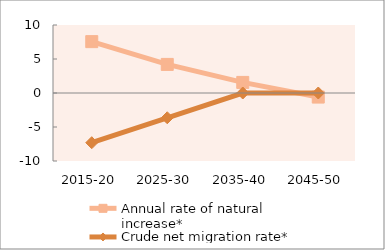
| Category | Annual rate of natural increase* | Crude net migration rate* |
|---|---|---|
| 2015-20 | 7.555 | -7.31 |
| 2025-30 | 4.204 | -3.641 |
| 2035-40 | 1.557 | 0 |
| 2045-50 | -0.599 | 0 |